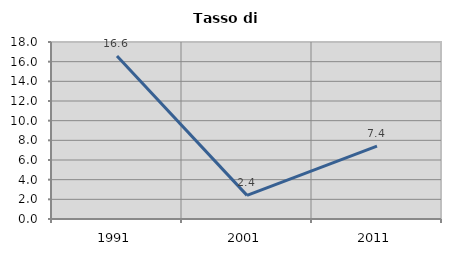
| Category | Tasso di disoccupazione   |
|---|---|
| 1991.0 | 16.585 |
| 2001.0 | 2.404 |
| 2011.0 | 7.407 |